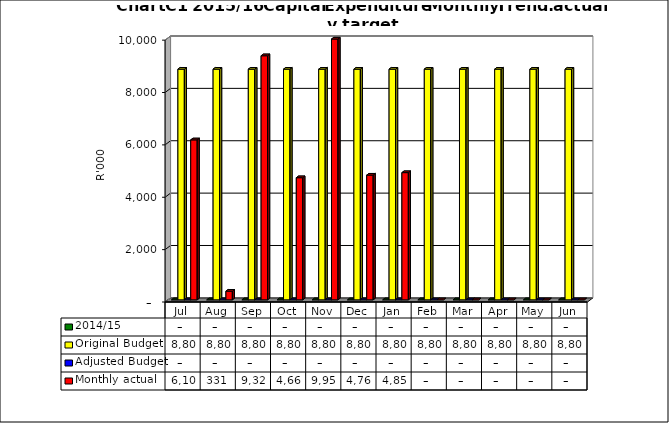
| Category | 2014/15 | Original Budget | Adjusted Budget | Monthly actual |
|---|---|---|---|---|
| Jul | 0 | 8808585.26 | 0 | 6108587 |
| Aug | 0 | 8808585.26 | 0 | 330675 |
| Sep | 0 | 8808585.26 | 0 | 9321519 |
| Oct | 0 | 8808585.26 | 0 | 4663933 |
| Nov | 0 | 8808585.26 | 0 | 9959155 |
| Dec | 0 | 8808585.26 | 0 | 4761825 |
| Jan | 0 | 8808585.26 | 0 | 4858051 |
| Feb | 0 | 8808585.26 | 0 | 0 |
| Mar | 0 | 8808585.26 | 0 | 0 |
| Apr | 0 | 8808585.26 | 0 | 0 |
| May | 0 | 8808585.26 | 0 | 0 |
| Jun | 0 | 8808585.26 | 0 | 0 |